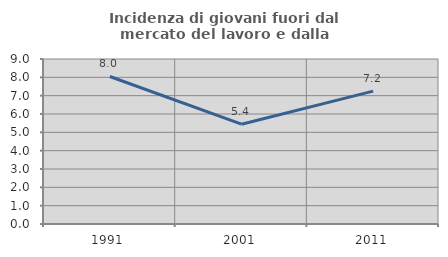
| Category | Incidenza di giovani fuori dal mercato del lavoro e dalla formazione  |
|---|---|
| 1991.0 | 8.046 |
| 2001.0 | 5.444 |
| 2011.0 | 7.246 |